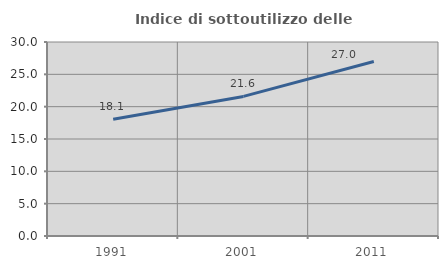
| Category | Indice di sottoutilizzo delle abitazioni  |
|---|---|
| 1991.0 | 18.061 |
| 2001.0 | 21.584 |
| 2011.0 | 26.995 |